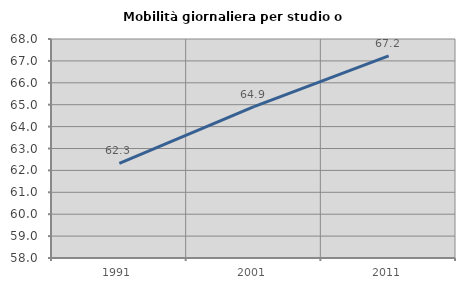
| Category | Mobilità giornaliera per studio o lavoro |
|---|---|
| 1991.0 | 62.324 |
| 2001.0 | 64.91 |
| 2011.0 | 67.23 |